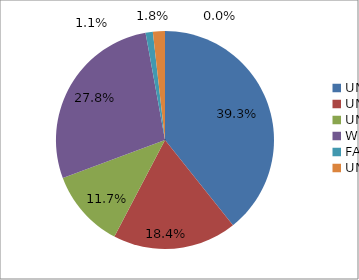
| Category | 2003 |
|---|---|
| UNHCR | 837.311 |
| UNRWA | 392.145 |
| UNICEF | 248.443 |
| WFP | 592.499 |
| FAO | 22.973 |
| UN OCHA | 37.984 |